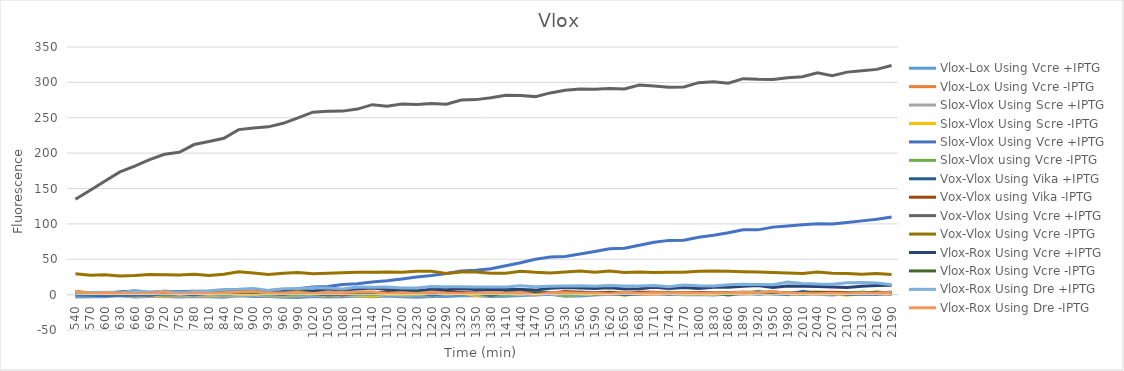
| Category | Vlox-Lox Using Vcre +IPTG | Vlox-Lox Using Vcre -IPTG | Slox-Vlox Using Scre +IPTG | Slox-Vlox Using Scre -IPTG | Slox-Vlox Using Vcre +IPTG | Slox-Vlox using Vcre -IPTG | Vox-Vlox Using Vika +IPTG | Vox-Vlox using Vika -IPTG | Vox-Vlox Using Vcre +IPTG | Vox-Vlox Using Vcre -IPTG | Vlox-Rox Using Vcre +IPTG | Vlox-Rox Using Vcre -IPTG | Vlox-Rox Using Dre +IPTG | Vlox-Rox Using Dre -IPTG |
|---|---|---|---|---|---|---|---|---|---|---|---|---|---|---|
| 540.0 | -3.5 | -1.75 | -1.333 | 0.083 | -0.5 | 0.25 | 0.5 | 4.25 | 134.75 | 29.5 | 1.5 | 2.75 | 2.5 | 4.5 |
| 570.0 | -2.875 | 0.625 | -1.458 | -0.458 | -1.375 | -0.125 | 0 | 2.25 | 147.5 | 27.25 | 1.5 | 1.25 | 2.75 | 1.75 |
| 600.0 | -3.125 | -0.25 | -1.583 | 0.417 | -1.083 | 0.583 | -0.75 | 1 | 160.75 | 28 | 2.25 | 1.5 | 3.25 | 2.25 |
| 630.0 | -1.25 | 0.25 | -1.708 | 0.042 | -1.208 | 0.208 | 0.5 | 1.25 | 173.5 | 26.25 | 3.75 | 2 | 2.5 | 2 |
| 660.0 | -3.5 | 0.125 | -3.125 | -0.792 | -1.208 | -0.042 | 0.125 | 2.125 | 181.625 | 26.875 | 5.125 | 1.625 | 5.875 | 1.625 |
| 690.0 | -2.75 | -1 | -2.458 | 0.125 | 0.708 | 0.458 | -1 | 3.25 | 190.75 | 28.5 | 2.5 | 1.5 | 3.5 | 1.5 |
| 720.0 | -2.625 | -1.625 | -2.875 | -1.875 | -0.542 | -0.292 | 1.375 | 2.875 | 198.375 | 28.125 | 4.875 | 4.125 | 4.875 | 3.625 |
| 750.0 | -3.25 | -0.375 | -1.958 | -0.375 | -0.042 | 0.292 | 0.5 | 1.75 | 201.25 | 27.75 | 4 | 2.5 | 3.5 | 0.25 |
| 780.0 | -2.75 | 0.5 | -1.917 | -0.083 | 0.417 | 2.333 | -0.125 | 4.375 | 212.125 | 28.625 | 4.625 | 2.375 | 4.375 | 2.125 |
| 810.0 | -2.875 | 0.375 | -1.5 | -0.583 | 1.167 | 1.417 | 2 | 3 | 216.5 | 27 | 4.25 | 3 | 5.5 | 1.5 |
| 840.0 | -3.875 | 0.25 | -2.167 | -0.5 | 1.5 | -0.417 | 1.5 | 1.5 | 221 | 28.75 | 5.25 | 2.75 | 7.25 | 2.5 |
| 870.0 | -1.75 | 0.625 | -1.583 | 0.667 | 4.583 | 1.417 | 2.5 | 3.25 | 233.25 | 32.25 | 6 | 2 | 7.5 | 3.75 |
| 900.0 | -2.75 | 1.875 | -0.5 | 0 | 6 | 1.833 | 2.5 | 3.75 | 235.5 | 30.5 | 4.5 | 2.5 | 8.75 | 4.5 |
| 930.0 | -2.625 | -0.625 | -1.875 | -0.292 | 5.875 | -0.292 | 2.375 | 1.625 | 237.125 | 28.375 | 4.875 | 2.375 | 5.875 | 2.125 |
| 960.0 | -3.625 | 0.375 | -2.167 | -0.667 | 7 | 0.25 | 0.375 | 0.875 | 242.125 | 30.375 | 5.375 | 0.625 | 8.375 | 2.125 |
| 990.0 | -4 | -0.5 | -1.708 | -0.542 | 8.292 | -0.125 | 2.5 | 2.5 | 249.75 | 31.25 | 6 | 5.5 | 8.25 | 3.25 |
| 1020.0 | -2.5 | -0.125 | -0.542 | 0.792 | 10.625 | 1.042 | 1.875 | 3.375 | 257.875 | 29.625 | 5.125 | 1.375 | 9.875 | 1.625 |
| 1050.0 | -3.25 | -1.5 | -1.75 | -1.083 | 11.583 | 0.083 | -0.375 | 1.875 | 259.125 | 30.375 | 7.875 | 0.875 | 9.375 | 3.375 |
| 1080.0 | -3 | -0.25 | -0.75 | 0.167 | 14.25 | 0.833 | 0.625 | -0.375 | 259.375 | 30.875 | 6.125 | 1.125 | 7.875 | 2.875 |
| 1110.0 | -1.875 | 0.25 | -0.75 | -0.833 | 15.25 | 0.083 | 1.5 | 3.5 | 262.25 | 31.75 | 8 | 1.75 | 10.75 | 3.75 |
| 1140.0 | -3 | -1 | -1.208 | -2.125 | 17.875 | -0.125 | 2.5 | 2.75 | 268.5 | 31.5 | 9.25 | 2.75 | 10.5 | 4 |
| 1170.0 | -1.875 | 1.25 | 0.083 | 0.417 | 19.667 | 1.083 | 2.625 | 2.875 | 266.375 | 32.125 | 7.375 | 1.625 | 10.875 | 1.375 |
| 1200.0 | -3 | 0.625 | -0.875 | -0.042 | 21.958 | 1.125 | 1.5 | 2.75 | 269.5 | 31.75 | 6.75 | 2.25 | 9.5 | 2.5 |
| 1230.0 | -3.75 | 0.5 | -0.542 | 0.125 | 25.042 | 0.875 | 2.875 | 2.875 | 268.875 | 32.875 | 5.625 | 3.125 | 9.375 | 1.375 |
| 1260.0 | -2.5 | -0.75 | -0.667 | 0.167 | 27.167 | 0.667 | -0.625 | 1.375 | 270.125 | 33.125 | 7.625 | 2.125 | 11.375 | 3.625 |
| 1290.0 | -2.625 | 1.375 | 0.417 | 1 | 29.917 | 3 | 1.5 | 4 | 269.25 | 29.75 | 6.75 | 2.25 | 11 | 2 |
| 1320.0 | -1.5 | 1.375 | 1.75 | 1.417 | 33.25 | 2.583 | 1.125 | 2.875 | 275.125 | 31.875 | 8.375 | 0.625 | 11.125 | 1.125 |
| 1350.0 | -1.75 | -0.125 | -0.208 | -1.375 | 34.375 | 0.792 | 2.625 | 1.875 | 275.625 | 32.125 | 7.125 | 2.125 | 10.625 | 1.875 |
| 1380.0 | -2.625 | -0.25 | 0.458 | 0.375 | 36.708 | -0.125 | 1.5 | 2.25 | 278.25 | 30.25 | 7.5 | -0.75 | 10.75 | 2.75 |
| 1410.0 | -2.375 | 0.125 | 0.333 | -0.25 | 40.75 | -0.5 | 1.625 | 2.125 | 281.875 | 30.375 | 7.125 | 2.625 | 10.875 | 1.625 |
| 1440.0 | -1.375 | 0.75 | 0.292 | 0.792 | 44.958 | 1.792 | 2.625 | 2.375 | 281.375 | 33.125 | 7.375 | 2.875 | 12.375 | 3.375 |
| 1470.0 | -0.5 | 2.625 | 1.875 | 2.292 | 49.958 | 2.708 | 2.125 | 0.875 | 279.875 | 31.625 | 6.375 | 1.875 | 11.125 | -0.375 |
| 1500.0 | 0.5 | 1.625 | 1.667 | 1.917 | 53.25 | 3.083 | 2.875 | 2.125 | 285.125 | 30.625 | 9.125 | 2.625 | 11.875 | 2.625 |
| 1530.0 | -2.125 | -1 | -0.417 | -1.083 | 54 | -1.167 | 2 | 4.25 | 288.75 | 32 | 10 | 1.5 | 12.25 | 2.75 |
| 1560.0 | -1.875 | 0.125 | 0.5 | 0.333 | 57.333 | 0.667 | 3.5 | 3.5 | 290.5 | 33.5 | 9.25 | 3 | 12.5 | 2 |
| 1590.0 | -0.375 | 0.375 | 0.917 | 0.583 | 61 | 2 | 2.875 | 2.125 | 290.125 | 31.625 | 8.625 | 0.875 | 11.875 | 2.375 |
| 1620.0 | 0.5 | 1.125 | 2.125 | 1.792 | 64.875 | 2.708 | 2 | 3.25 | 291.25 | 33.5 | 9.75 | 2 | 13 | 0.75 |
| 1650.0 | 0.125 | 0.5 | 1.458 | -0.792 | 65.708 | 0.875 | -0.125 | 1.875 | 290.625 | 31.125 | 8.125 | 2.125 | 12.125 | 2.875 |
| 1680.0 | 0.125 | 0.875 | 1.208 | 1.542 | 69.792 | 2.625 | 1.375 | 3.375 | 296.125 | 31.875 | 8.375 | 1.625 | 12.125 | 1.625 |
| 1710.0 | 1.125 | 0.625 | 2.708 | 0.792 | 73.958 | 2.875 | 2.125 | 3.375 | 294.875 | 31.125 | 10.375 | 1.875 | 12.875 | 2.625 |
| 1740.0 | 1.125 | 1.625 | 1.667 | 1.833 | 76.667 | 3.333 | 2.5 | 2.25 | 293 | 31.5 | 8.5 | 0.5 | 11.25 | 2.25 |
| 1770.0 | -0.25 | 0.75 | 1.083 | 0.833 | 76.917 | 1.5 | 1.5 | 3 | 293.5 | 31.5 | 10 | 2.5 | 13.5 | 2.75 |
| 1800.0 | 0 | 0.75 | 2 | 1 | 81.167 | 2.083 | 2.625 | 3.125 | 299.625 | 32.875 | 8.625 | 1.375 | 12.625 | 1.875 |
| 1830.0 | -0.375 | 0.375 | 1.25 | 0.417 | 83.917 | 1.667 | 2 | 2.25 | 301 | 33.25 | 10.5 | 2 | 12.25 | 2 |
| 1860.0 | 0.875 | 2.125 | 3.042 | 0.958 | 87.458 | 2.792 | 1.625 | 2.375 | 298.875 | 32.875 | 10.375 | -0.625 | 14.125 | 2.375 |
| 1890.0 | 2 | 0.625 | 3.25 | 2.25 | 91.75 | 3.417 | 1.75 | 2.75 | 305.25 | 32.5 | 11.75 | 2 | 14.75 | 3.25 |
| 1920.0 | 0.5 | 2 | 2.042 | 1.792 | 91.542 | 3.625 | 3.875 | 2.875 | 304.375 | 31.875 | 12.875 | 1.125 | 14.375 | 2.625 |
| 1950.0 | 2.625 | 1.625 | 4.083 | 2.583 | 95.417 | 3.583 | 1.375 | 2.875 | 304.125 | 31.375 | 10.125 | 1.125 | 13.875 | 4.375 |
| 1980.0 | 0 | 0.875 | 1.958 | 1.125 | 97.125 | 2.042 | 0.5 | 2 | 306.5 | 30.5 | 12.25 | 2 | 17.75 | 1.5 |
| 2010.0 | 1.125 | 1.625 | 2.667 | 0.833 | 98.667 | 3.083 | 4.5 | 2 | 308 | 30 | 11.75 | 1 | 15.75 | 1.75 |
| 2040.0 | 0.5 | 1.125 | 2.542 | 0.958 | 100.208 | 3.708 | 2.125 | 2.875 | 313.625 | 32.125 | 11.625 | 1.875 | 14.875 | 1.375 |
| 2070.0 | -0.375 | 0.875 | 1.667 | 1.5 | 99.667 | 2.583 | 2.875 | 3.375 | 309.375 | 30.125 | 10.875 | 1.125 | 14.625 | 1.875 |
| 2100.0 | 1.5 | 0.125 | 1.917 | -0.833 | 102.083 | 1.75 | 0.25 | 2.75 | 314.5 | 29.75 | 10 | 1.75 | 16.75 | 1.25 |
| 2130.0 | 2.25 | 2 | 2.5 | 2.25 | 104.25 | 3.667 | 1 | 1.75 | 316.5 | 28.75 | 12 | 1.5 | 17.25 | 2 |
| 2160.0 | 2 | 1 | 2.125 | 1.875 | 106.625 | 2.042 | 0.625 | 3.625 | 318.375 | 29.875 | 12.875 | 2.625 | 16.375 | 2.125 |
| 2190.0 | 3.75 | 0.625 | 3.167 | 1.417 | 109.833 | 2.667 | 2 | 2 | 323.75 | 28.5 | 13.25 | 1 | 14 | 2.75 |